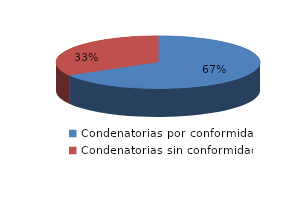
| Category | Series 0 |
|---|---|
| 0 | 32 |
| 1 | 16 |